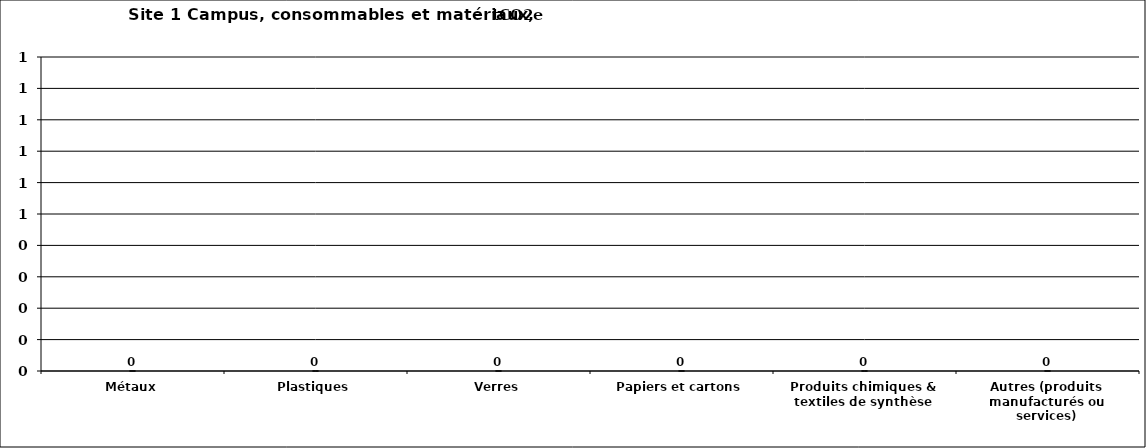
| Category | Series 0 |
|---|---|
| Métaux | 0 |
| Plastiques | 0 |
| Verres | 0 |
| Papiers et cartons | 0 |
| Produits chimiques & textiles de synthèse | 0 |
| Autres (produits manufacturés ou services) | 0 |